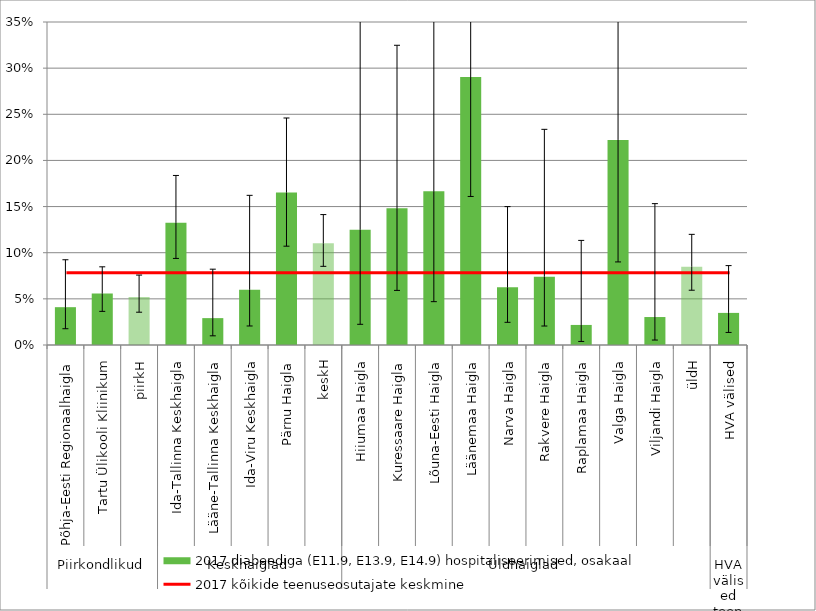
| Category | 2017 diabeediga (E11.9, E13.9, E14.9) hospitaliseerimised, osakaal |
|---|---|
| 0 | 0.041 |
| 1 | 0.056 |
| 2 | 0.052 |
| 3 | 0.132 |
| 4 | 0.029 |
| 5 | 0.06 |
| 6 | 0.165 |
| 7 | 0.11 |
| 8 | 0.125 |
| 9 | 0.148 |
| 10 | 0.167 |
| 11 | 0.29 |
| 12 | 0.062 |
| 13 | 0.074 |
| 14 | 0.022 |
| 15 | 0.222 |
| 16 | 0.03 |
| 17 | 0.085 |
| 18 | 0.035 |